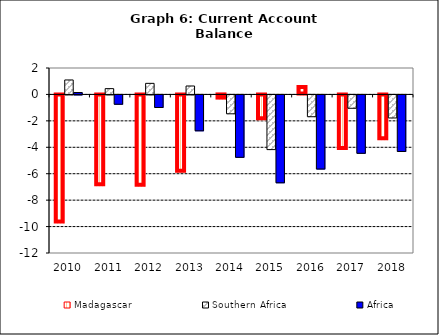
| Category | Madagascar | Southern Africa | Africa |
|---|---|---|---|
| 2010.0 | -9.685 | 1.095 | 0.144 |
| 2011.0 | -6.878 | 0.439 | -0.706 |
| 2012.0 | -6.907 | 0.839 | -0.95 |
| 2013.0 | -5.857 | 0.638 | -2.715 |
| 2014.0 | -0.315 | -1.429 | -4.722 |
| 2015.0 | -1.887 | -4.138 | -6.65 |
| 2016.0 | 0.57 | -1.65 | -5.608 |
| 2017.0 | -4.129 | -1.011 | -4.418 |
| 2018.0 | -3.387 | -1.744 | -4.278 |